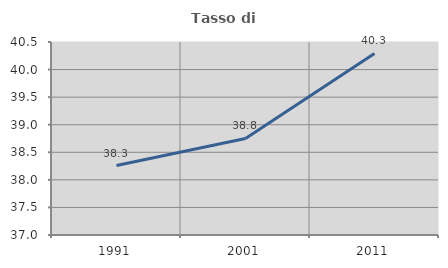
| Category | Tasso di occupazione   |
|---|---|
| 1991.0 | 38.259 |
| 2001.0 | 38.751 |
| 2011.0 | 40.293 |